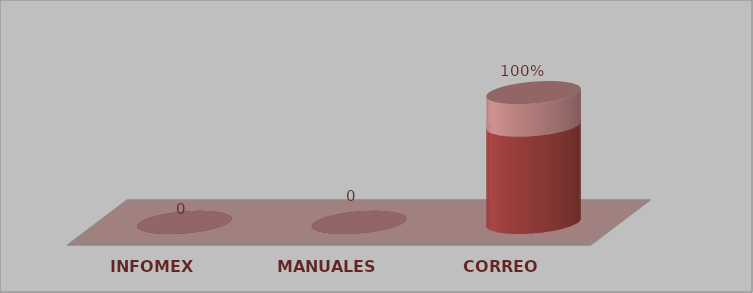
| Category | Series 0 | Series 1 |
|---|---|---|
| INFOMEX | 0 | 0 |
| MANUALES | 0 | 0 |
| CORREO | 3 | 1 |